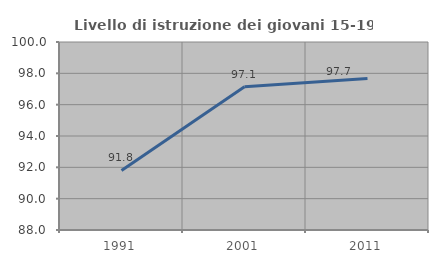
| Category | Livello di istruzione dei giovani 15-19 anni |
|---|---|
| 1991.0 | 91.803 |
| 2001.0 | 97.143 |
| 2011.0 | 97.674 |